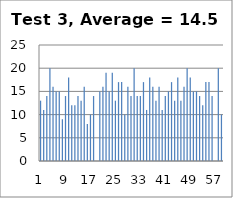
| Category | Series 0 |
|---|---|
| 0 | 13 |
| 1 | 11 |
| 2 | 14 |
| 3 | 20 |
| 4 | 16 |
| 5 | 15 |
| 6 | 15 |
| 7 | 9 |
| 8 | 14 |
| 9 | 18 |
| 10 | 12 |
| 11 | 12 |
| 12 | 14 |
| 13 | 13 |
| 14 | 16 |
| 15 | 8 |
| 16 | 10 |
| 17 | 14 |
| 18 | 0 |
| 19 | 15 |
| 20 | 16 |
| 21 | 19 |
| 22 | 15 |
| 23 | 19 |
| 24 | 13 |
| 25 | 17 |
| 26 | 17 |
| 27 | 10 |
| 28 | 16 |
| 29 | 14 |
| 30 | 20 |
| 31 | 14 |
| 32 | 14 |
| 33 | 17 |
| 34 | 11 |
| 35 | 18 |
| 36 | 16 |
| 37 | 13 |
| 38 | 16 |
| 39 | 11 |
| 40 | 14 |
| 41 | 15 |
| 42 | 17 |
| 43 | 13 |
| 44 | 18 |
| 45 | 13 |
| 46 | 16 |
| 47 | 20 |
| 48 | 18 |
| 49 | 15 |
| 50 | 15 |
| 51 | 14 |
| 52 | 12 |
| 53 | 17 |
| 54 | 17 |
| 55 | 14 |
| 56 | 0 |
| 57 | 20 |
| 58 | 10 |